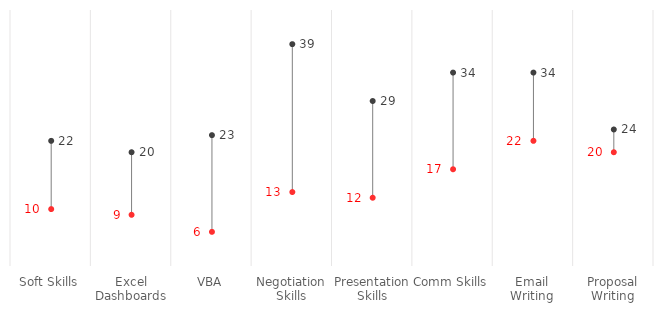
| Category | Budget | Series 1 | Series 2 |
|---|---|---|---|
| Soft Skills | 22 | 10 |  |
| Excel Dashboards | 20 | 9 |  |
| VBA | 23 | 6 |  |
| Negotiation Skills | 39 | 13 |  |
| Presentation Skills | 29 | 12 |  |
| Comm Skills | 34 | 17 |  |
| Email Writing | 34 | 22 |  |
| Proposal Writing | 24 | 20 |  |